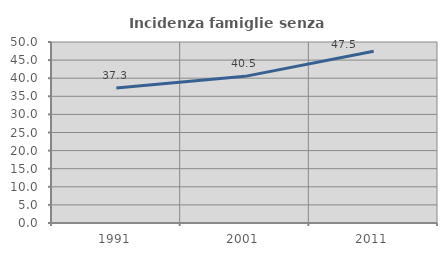
| Category | Incidenza famiglie senza nuclei |
|---|---|
| 1991.0 | 37.27 |
| 2001.0 | 40.51 |
| 2011.0 | 47.452 |